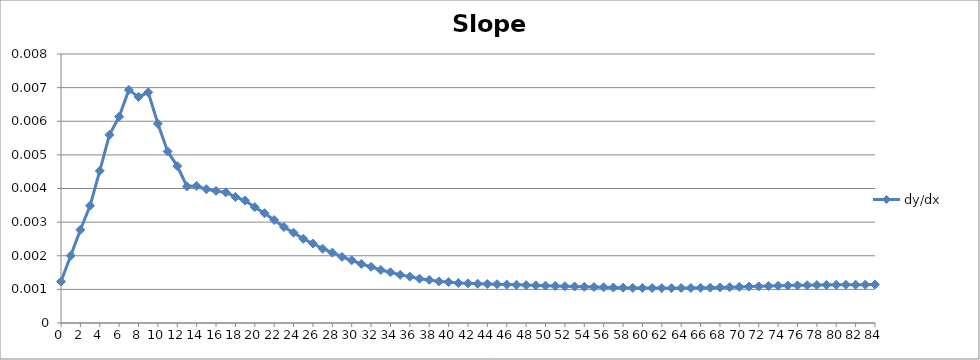
| Category | dy/dx |
|---|---|
| 0.0 | 0.001 |
| 1.0 | 0.002 |
| 2.0 | 0.003 |
| 3.0 | 0.003 |
| 4.0 | 0.005 |
| 5.0 | 0.006 |
| 6.0 | 0.006 |
| 7.0 | 0.007 |
| 8.0 | 0.007 |
| 9.0 | 0.007 |
| 10.0 | 0.006 |
| 11.0 | 0.005 |
| 12.0 | 0.005 |
| 13.0 | 0.004 |
| 14.0 | 0.004 |
| 15.0 | 0.004 |
| 16.0 | 0.004 |
| 17.0 | 0.004 |
| 18.0 | 0.004 |
| 19.0 | 0.004 |
| 20.0 | 0.003 |
| 21.0 | 0.003 |
| 22.0 | 0.003 |
| 23.0 | 0.003 |
| 24.0 | 0.003 |
| 25.0 | 0.003 |
| 26.0 | 0.002 |
| 27.0 | 0.002 |
| 28.0 | 0.002 |
| 29.0 | 0.002 |
| 30.0 | 0.002 |
| 31.0 | 0.002 |
| 32.0 | 0.002 |
| 33.0 | 0.002 |
| 34.0 | 0.002 |
| 35.0 | 0.001 |
| 36.0 | 0.001 |
| 37.0 | 0.001 |
| 38.0 | 0.001 |
| 39.0 | 0.001 |
| 40.0 | 0.001 |
| 41.0 | 0.001 |
| 42.0 | 0.001 |
| 43.0 | 0.001 |
| 44.0 | 0.001 |
| 45.0 | 0.001 |
| 46.0 | 0.001 |
| 47.0 | 0.001 |
| 48.0 | 0.001 |
| 49.0 | 0.001 |
| 50.0 | 0.001 |
| 51.0 | 0.001 |
| 52.0 | 0.001 |
| 53.0 | 0.001 |
| 54.0 | 0.001 |
| 55.0 | 0.001 |
| 56.0 | 0.001 |
| 57.0 | 0.001 |
| 58.0 | 0.001 |
| 59.0 | 0.001 |
| 60.0 | 0.001 |
| 61.0 | 0.001 |
| 62.0 | 0.001 |
| 63.0 | 0.001 |
| 64.0 | 0.001 |
| 65.0 | 0.001 |
| 66.0 | 0.001 |
| 67.0 | 0.001 |
| 68.0 | 0.001 |
| 69.0 | 0.001 |
| 70.0 | 0.001 |
| 71.0 | 0.001 |
| 72.0 | 0.001 |
| 73.0 | 0.001 |
| 74.0 | 0.001 |
| 75.0 | 0.001 |
| 76.0 | 0.001 |
| 77.0 | 0.001 |
| 78.0 | 0.001 |
| 79.0 | 0.001 |
| 80.0 | 0.001 |
| 81.0 | 0.001 |
| 82.0 | 0.001 |
| 83.0 | 0.001 |
| 84.0 | 0.001 |